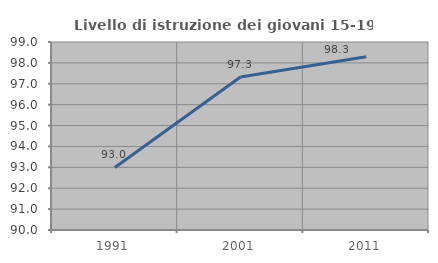
| Category | Livello di istruzione dei giovani 15-19 anni |
|---|---|
| 1991.0 | 92.995 |
| 2001.0 | 97.323 |
| 2011.0 | 98.289 |